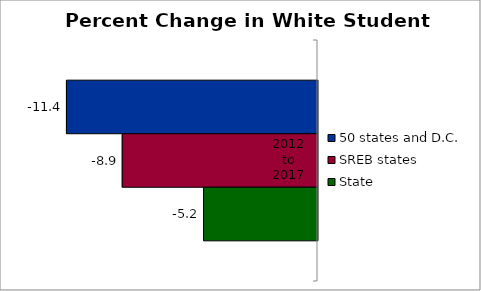
| Category | 50 states and D.C. | SREB states | State |
|---|---|---|---|
| 2012 to 2017 | -11.449 | -8.905 | -5.195 |